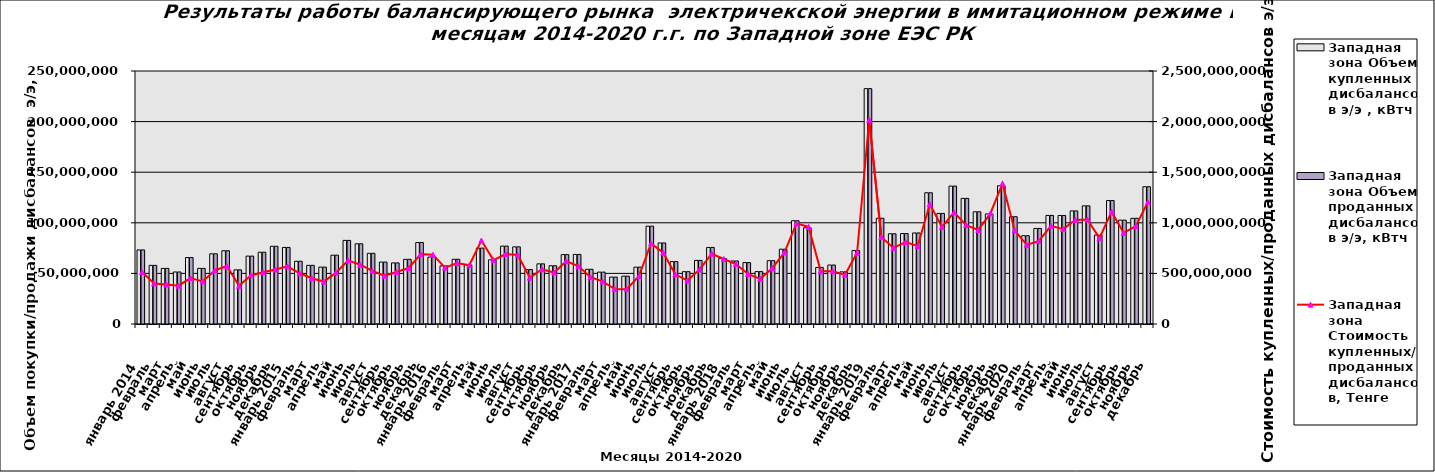
| Category | Западная зона |
|---|---|
| Январь 2014 | 73198558.064 |
| февраль | 57950604.065 |
| март | 54939638.45 |
| апрель | 51413394.167 |
| май | 65678195.32 |
| июнь | 54962102.433 |
| июль | 69362349.113 |
| август | 72402794.066 |
| сентябрь | 53505508.895 |
| октябрь | 67085840.145 |
| ноябрь | 70921876.971 |
| декабрь | 76802486.574 |
| Январь 2015 | 75678145 |
| февраль | 61994883 |
| март | 57952214 |
| апрель | 56221234 |
| май | 68007821 |
| июнь | 82615062 |
| июль | 79271838 |
| август | 69858760 |
| сентябрь | 61208062 |
| октябрь | 60381758 |
| ноябрь | 63917979 |
| декабрь | 80518627 |
| Январь 2016 | 66168276 |
| февраль | 57457290 |
| март | 63956506 |
| апрель | 58407658 |
| май | 74990973 |
| июнь | 63375877 |
| июль | 76994220 |
| август | 76226225 |
| сентябрь | 53804191 |
| октябрь | 59433122 |
| ноябрь | 57588007 |
| декабрь | 68574369 |
| Январь 2017 | 68743057 |
| февраль | 54058654 |
| март | 51281744 |
| апрель | 46360426 |
| май | 47285983 |
| июнь | 56184513 |
| июль | 96671036 |
| август | 80076058 |
| сентябрь | 61671945 |
| октябрь | 51707457 |
| ноябрь | 62851899 |
| декабрь | 75665839 |
| Январь 2018 | 64680363 |
| февраль | 62298230 |
| март | 60680858 |
| апрель | 51772562 |
| май | 62583156 |
| июнь | 73915493 |
| июль  | 102041827 |
| август | 95053733 |
| сентябрь | 55887440 |
| октябрь | 58281819 |
| ноябрь | 51550841 |
| декабрь | 72578999 |
| Январь 2019 | 232571111 |
| февраль | 104495798 |
| март | 89144589 |
| апрель | 89357672 |
| май | 89961006 |
| июнь | 129685630 |
| июль | 109277768 |
| август | 136285069 |
| сентябрь | 124123131 |
| октябрь | 110864865 |
| ноябрь | 108756664 |
| декабрь | 136579308 |
| Январь 2020 | 106010384 |
| февраль | 87239092 |
| март | 94437423 |
| апрель | 107276219 |
| май | 107216100 |
| июнь | 111757031 |
| июль | 116767889 |
| август | 87854635 |
| сентябрь | 121981050 |
| октябрь | 102636590 |
| ноябрь | 104431007 |
| декабрь | 135652317 |